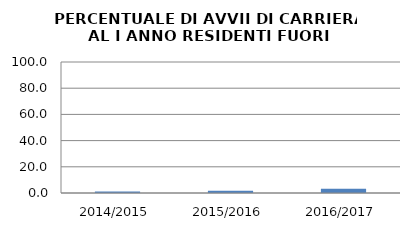
| Category | 2014/2015 2015/2016 2016/2017 |
|---|---|
| 2014/2015 | 1.22 |
| 2015/2016 | 1.786 |
| 2016/2017 | 3.252 |